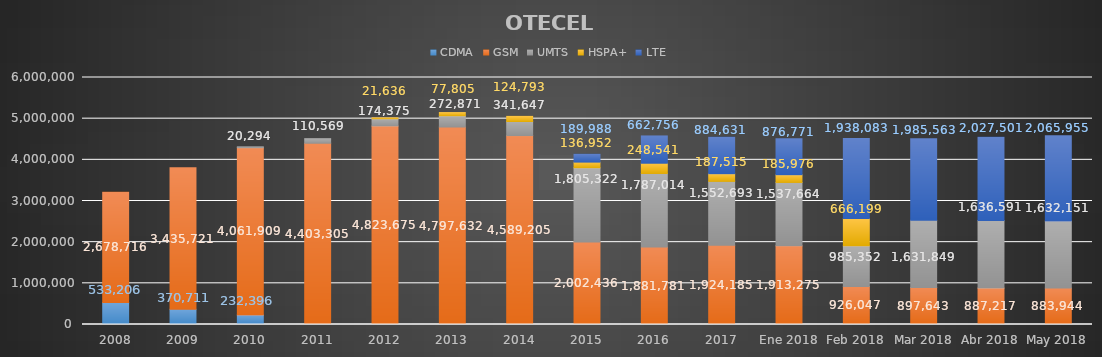
| Category | CDMA | GSM | UMTS | HSPA+ | LTE |
|---|---|---|---|---|---|
| 2008 | 533206 | 2678716 | 0 | 0 | 0 |
| 2009 | 370711 | 3435721 | 0 | 0 | 0 |
| 2010 | 232396 | 4061909 | 20294 | 0 | 0 |
| 2011 | 0 | 4403305 | 110569 | 0 | 0 |
| 2012 | 0 | 4823675 | 174375 | 21636 | 0 |
| 2013 | 0 | 4797632 | 272871 | 77805 | 0 |
| 2014 | 0 | 4589205 | 341647 | 124793 | 0 |
| 2015 | 0 | 2002436 | 1805322 | 136952 | 189988 |
| 2016 | 0 | 1881781 | 1787014 | 248541 | 662756 |
| 2017 | 0 | 1924184.634 | 1552693.066 | 187515.199 | 884631.101 |
| Ene 2018 | 0 | 1913275.234 | 1537663.541 | 185976.354 | 876770.87 |
| Feb 2018 | 0 | 926046.811 | 985351.79 | 666198.977 | 1938083.422 |
| Mar 2018 | 0 | 897642.855 | 1631848.532 | 0 | 1985562.614 |
| Abr 2018 | 0 | 887216.931 | 1636591.2 | 0 | 2027500.869 |
| May 2018 | 0 | 883943.914 | 1632150.971 | 0 | 2065955.116 |